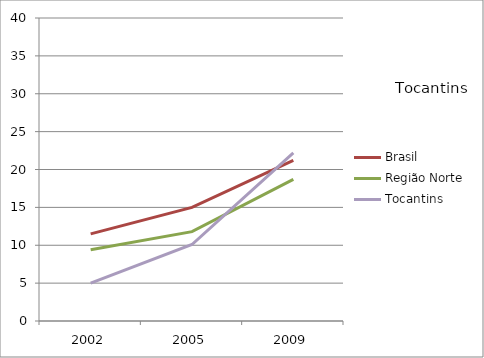
| Category | Brasil | Região Norte | Tocantins |
|---|---|---|---|
| 2002.0 | 11.5 | 9.4 | 5 |
| 2005.0 | 15 | 11.8 | 10.1 |
| 2009.0 | 21.2 | 18.7 | 22.2 |